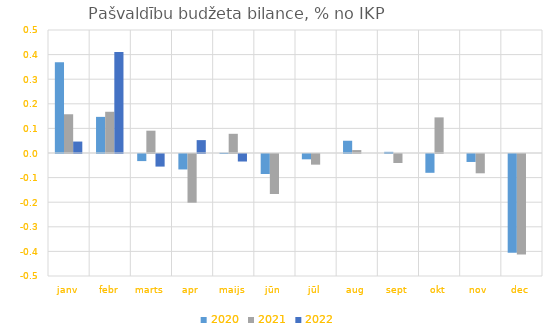
| Category | 2020 | 2021 | 2022 |
|---|---|---|---|
| janv | 0.369 | 0.157 | 0.047 |
| febr | 0.147 | 0.168 | 0.411 |
| marts | -0.029 | 0.091 | -0.051 |
| apr | -0.063 | -0.198 | 0.052 |
| maijs | 0.001 | 0.078 | -0.031 |
| jūn | -0.081 | -0.163 | 0 |
| jūl | -0.022 | -0.043 | 0 |
| aug | 0.05 | 0.012 | 0 |
| sept | 0.005 | -0.037 | 0 |
| okt | -0.076 | 0.145 | 0 |
| nov | -0.032 | -0.078 | 0 |
| dec | -0.401 | -0.408 | 0 |